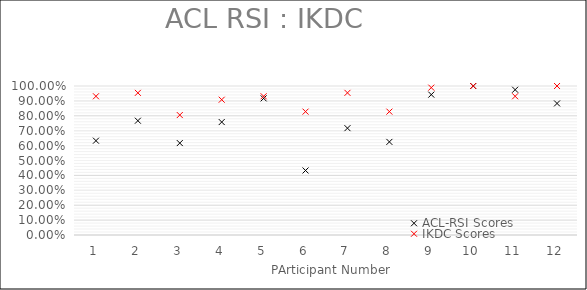
| Category | ACL-RSI Scores | IKDC Scores |
|---|---|---|
| 0 | 0.633 | 0.931 |
| 1 | 0.767 | 0.954 |
| 2 | 0.617 | 0.805 |
| 3 | 0.758 | 0.908 |
| 4 | 0.917 | 0.931 |
| 5 | 0.433 | 0.828 |
| 6 | 0.717 | 0.954 |
| 7 | 0.625 | 0.828 |
| 8 | 0.942 | 0.989 |
| 9 | 1 | 1 |
| 10 | 0.975 | 0.931 |
| 11 | 0.883 | 1 |